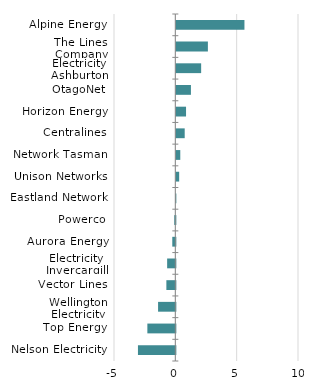
| Category | Series 0 |
|---|---|
| Alpine Energy | 5.552 |
| The Lines Company | 2.572 |
| Electricity Ashburton | 2.023 |
| OtagoNet | 1.19 |
| Horizon Energy | 0.791 |
| Centralines | 0.683 |
| Network Tasman | 0.322 |
| Unison Networks | 0.231 |
| Eastland Network | -0.008 |
| Powerco | -0.088 |
| Aurora Energy | -0.249 |
| Electricity Invercargill | -0.668 |
| Vector Lines | -0.731 |
| Wellington Electricity | -1.407 |
| Top Energy | -2.281 |
| Nelson Electricity | -3.047 |